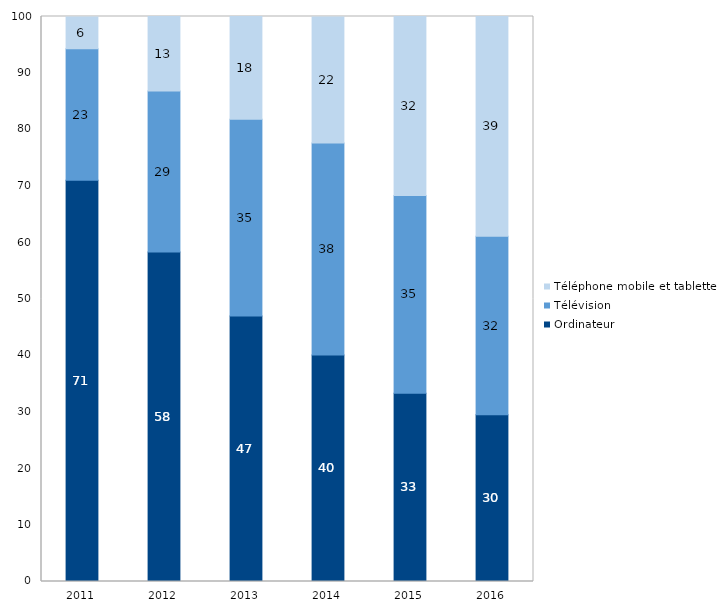
| Category | Ordinateur | Télévision | Téléphone mobile et tablette |
|---|---|---|---|
| 2011.0 | 71 | 23.3 | 5.6 |
| 2012.0 | 58.3 | 28.5 | 13.2 |
| 2013.0 | 47 | 34.8 | 18.2 |
| 2014.0 | 40.1 | 37.5 | 22.3 |
| 2015.0 | 33.3 | 35 | 31.7 |
| 2016.0 | 29.5 | 31.6 | 38.9 |